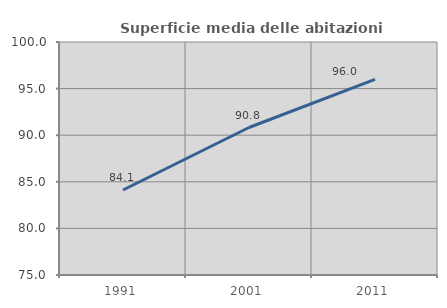
| Category | Superficie media delle abitazioni occupate |
|---|---|
| 1991.0 | 84.121 |
| 2001.0 | 90.825 |
| 2011.0 | 95.992 |